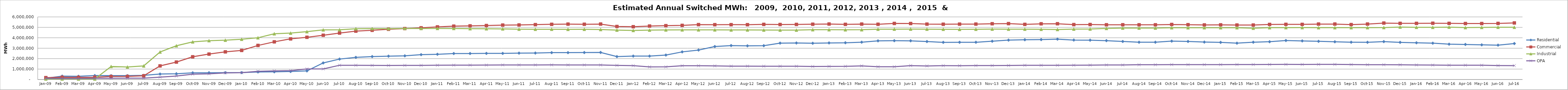
| Category | Residential | Commercial | Industrial | OPA |
|---|---|---|---|---|
| 2009-01-01 | 119696 | 179778 | 49990 | 119131 |
| 2009-02-01 | 326290 | 215163 | 48996 | 109386 |
| 2009-03-01 | 309347 | 211281 | 47012 | 108221 |
| 2009-04-01 | 377102 | 218512 | 47964 | 119484 |
| 2009-05-01 | 372148 | 290014 | 1250564 | 121119 |
| 2009-06-01 | 371860 | 299729 | 1199118 | 129184 |
| 2009-07-01 | 400111 | 359474 | 1305346 | 130208 |
| 2009-08-01 | 524435 | 1306417 | 2638779 | 225078 |
| 2009-09-01 | 553177 | 1671531 | 3233894 | 334092 |
| 2009-10-01 | 638036 | 2180446 | 3609150 | 510559 |
| 2009-11-01 | 646906 | 2437099 | 3724824 | 544710 |
| 2009-12-01 | 654882 | 2649024 | 3769767 | 635862 |
| 2010-01-01 | 662250 | 2787787 | 3855972 | 656594 |
| 2010-02-01 | 724629 | 3264717 | 4001720 | 784729 |
| 2010-03-01 | 738129 | 3612261 | 4385903 | 823743 |
| 2010-04-01 | 769283 | 3897049 | 4447564 | 847674 |
| 2010-05-01 | 823104 | 4046905 | 4585841 | 1017008 |
| 2010-06-01 | 1588549 | 4240111 | 4757604 | 1013359 |
| 2010-07-01 | 1958145 | 4454321 | 4767539 | 1365581 |
| 2010-08-01 | 2121736 | 4639154 | 4864297 | 1363361 |
| 2010-09-01 | 2198621 | 4718387 | 4879682 | 1351830 |
| 2010-10-01 | 2238900 | 4815663 | 4874550 | 1348960 |
| 2010-11-01 | 2269447 | 4881400 | 4896848 | 1354616 |
| 2010-12-01 | 2382687 | 4953122 | 4888556 | 1356287 |
| 2011-01-01 | 2419729 | 5043039 | 4895563 | 1367185 |
| 2011-02-01 | 2488525 | 5112912 | 4892822 | 1374592 |
| 2011-03-01 | 2490217 | 5141543 | 4871839 | 1381787 |
| 2011-04-01 | 2505522 | 5173258 | 4861267 | 1383358 |
| 2011-05-01 | 2505000 | 5215825 | 4852552 | 1398396 |
| 2011-06-01 | 2526521 | 5230000 | 4822791 | 1398046 |
| 2011-07-01 | 2537770 | 5262147 | 4816164 | 1396836 |
| 2011-08-01 | 2574738 | 5291669 | 4819146 | 1399918 |
| 2011-09-01 | 2575455 | 5308361 | 4811869 | 1395577 |
| 2011-10-01 | 2586204 | 5297829 | 4814458 | 1394622 |
| 2011-11-01 | 2592386 | 5313728 | 4791162 | 1392727 |
| 2011-12-01 | 2196456 | 5080337 | 4737892 | 1356181 |
| 2012-01-01 | 2245278 | 5061233 | 4701843 | 1326095 |
| 2012-02-01 | 2243429 | 5123944 | 4733304 | 1211773 |
| 2012-03-01 | 2343157 | 5161824 | 4751098 | 1212489 |
| 2012-04-01 | 2647709 | 5191364 | 4755945 | 1317777 |
| 2012-05-01 | 2824165 | 5264223 | 4756900 | 1319310 |
| 2012-06-01 | 3161747 | 5257246 | 4756276 | 1306358 |
| 2012-07-01 | 3254496 | 5258254 | 4747844 | 1284042 |
| 2012-08-01 | 3228536 | 5255386 | 4750308 | 1283052 |
| 2012-09-01 | 3243625 | 5284689 | 4743458 | 1275321 |
| 2012-10-01 | 3486498.875 | 5272278.412 | 4737800.932 | 1275811.03 |
| 2012-11-01 | 3500655 | 5279504 | 4733744 | 1271320 |
| 2012-12-01 | 3476551.923 | 5300510.721 | 4777945.584 | 1248644.006 |
| 2013-01-01 | 3506331 | 5318420 | 4773565 | 1260209 |
| 2013-02-01 | 3522957.257 | 5288879.244 | 4765530.203 | 1266718.605 |
| 2013-03-01 | 3578729.311 | 5311081.124 | 4774342.895 | 1307727.554 |
| 2013-04-01 | 3706233.652 | 5297523.891 | 4821616.803 | 1227224.746 |
| 2013-05-01 | 3721453.197 | 5372691.875 | 4826247.761 | 1226404.312 |
| 2013-06-01 | 3707433.965 | 5366852.475 | 4832503.985 | 1333591.087 |
| 2013-07-01 | 3640116.869 | 5307113.898 | 4824965.814 | 1300554.312 |
| 2013-08-01 | 3563231.009 | 5299570.116 | 4816025.587 | 1327656.044 |
| 2013-09-01 | 3570401 | 5307160 | 4806931 | 1325093 |
| 2013-10-01 | 3571315.96 | 5310060.522 | 4817470.592 | 1334103.988 |
| 2013-11-01 | 3671361.878 | 5343849.271 | 4828533.141 | 1336123.136 |
| 2013-12-01 | 3776770.41 | 5359460.064 | 4822893.502 | 1343064.729 |
| 2014-01-01 | 3808307.204 | 5285147.549 | 4823781.092 | 1363280.272 |
| 2014-02-01 | 3825382.222 | 5338650.518 | 4814142.434 | 1363423.999 |
| 2014-03-01 | 3871373 | 5344464 | 4794289 | 1365720 |
| 2014-04-01 | 3779531.835 | 5266057.216 | 4831198.112 | 1371707.207 |
| 2014-05-01 | 3770365.323 | 5270734.116 | 4841301.115 | 1381517.935 |
| 2014-06-01 | 3724962.567 | 5244028.493 | 4895058.126 | 1395572.35 |
| 2014-07-01 | 3646599.967 | 5246106.643 | 4931804.758 | 1392374.825 |
| 2014-08-01 | 3575307.982 | 5241893.792 | 4933529.447 | 1415232.299 |
| 2014-09-01 | 3575307.982 | 5241893.792 | 4933529.447 | 1415232.299 |
| 2014-10-01 | 3679966.462 | 5273842.471 | 4963294.246 | 1430879.644 |
| 2014-11-01 | 3648598.292 | 5256281.491 | 4960321.255 | 1426288.724 |
| 2014-12-01 | 3589078.164 | 5233468.036 | 4966152.439 | 1426639.25 |
| 2015-01-01 | 3559940.214 | 5238567.257 | 4964500.052 | 1430387.705 |
| 2015-02-01 | 3483088.573 | 5219578.961 | 4962693.751 | 1434957.499 |
| 2015-03-01 | 3573790.477 | 5220061.401 | 4915849.263 | 1434714.234 |
| 2015-04-01 | 3620628.326 | 5277960.584 | 4966879.682 | 1440628.432 |
| 2015-05-01 | 3736547.777 | 5289268.279 | 4973672.359 | 1447431.993 |
| 2015-06-01 | 3699219.772 | 5282728.579 | 4975829.22 | 1443122.417 |
| 2015-07-01 | 3661132.601 | 5312917.703 | 4967278.608 | 1450502.184 |
| 2015-08-01 | 3615336.726 | 5314075.145 | 4967903.113 | 1448419.125 |
| 2015-09-01 | 3577627.209 | 5266135.05 | 4970134.216 | 1431912.903 |
| 2015-10-01 | 3569369.305 | 5313355.454 | 4973513.61 | 1417813.974 |
| 2015-11-01 | 3630894.953 | 5408324.226 | 4981179.045 | 1417246.432 |
| 2015-12-01 | 3559980.671 | 5381495.319 | 5029962.125 | 1413137.777 |
| 2016-01-01 | 3519475.006 | 5380224.353 | 5003900.992 | 1394644.638 |
| 2016-02-01 | 3483694.208 | 5395587.293 | 5001517.662 | 1383086.232 |
| 2016-03-01 | 3387015.429 | 5380458.884 | 5020065.028 | 1374131.67 |
| 2016-04-01 | 3360793.231 | 5366038.04 | 4974656.807 | 1374311.526 |
| 2016-05-01 | 3320754.367 | 5364607.484 | 4991054.586 | 1366781.706 |
| 2016-06-01 | 3295505.251 | 5376080.576 | 5010177.694 | 1334925.842 |
| 2016-07-01 | 3445027.512 | 5424910.446 | 5007283.185 | 1333068.552 |